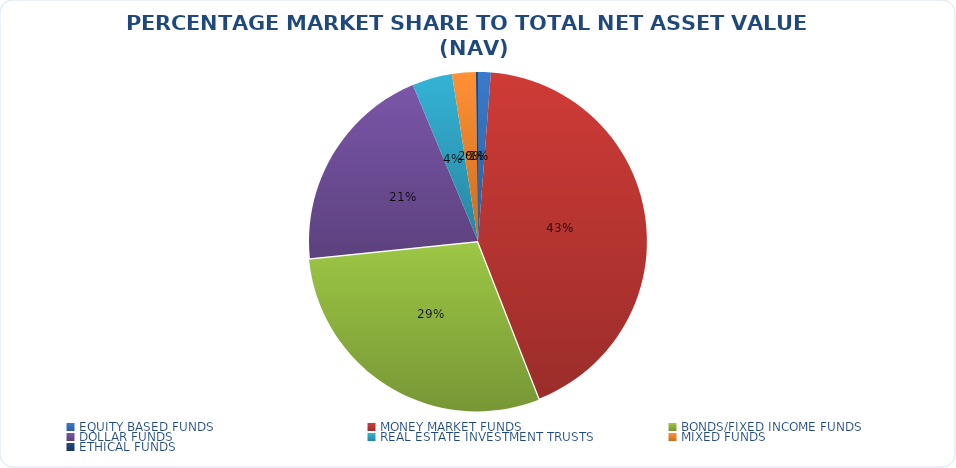
| Category | NET ASSET VALUE |
|---|---|
| EQUITY BASED FUNDS | 15804177330.21 |
| MONEY MARKET FUNDS | 555211389214.741 |
| BONDS/FIXED INCOME FUNDS | 379529154644.595 |
| DOLLAR FUNDS | 263471294752.346 |
| REAL ESTATE INVESTMENT TRUSTS | 49699693533.64 |
| MIXED FUNDS | 29400118520.269 |
| ETHICAL FUNDS | 2533880156.75 |